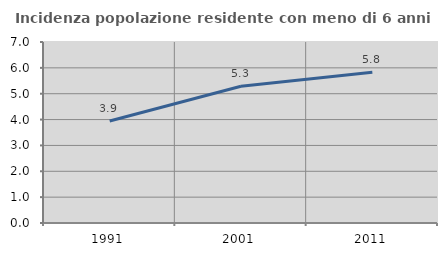
| Category | Incidenza popolazione residente con meno di 6 anni |
|---|---|
| 1991.0 | 3.945 |
| 2001.0 | 5.291 |
| 2011.0 | 5.833 |